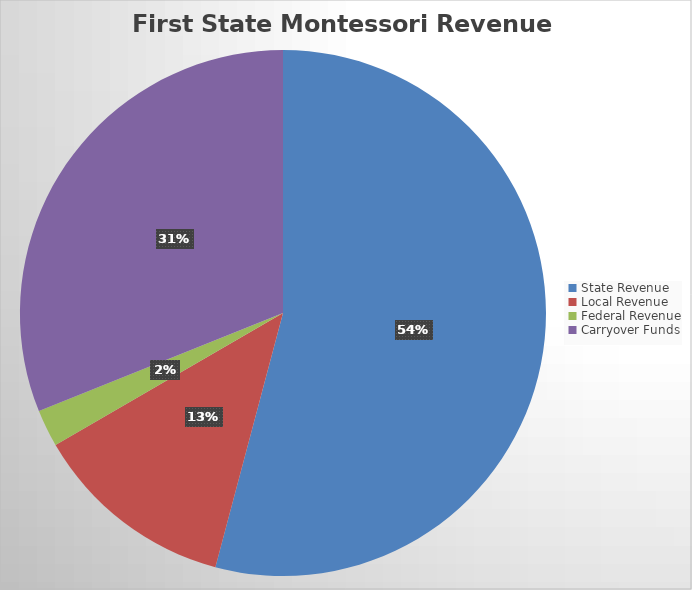
| Category | Series 0 |
|---|---|
| State Revenue | 5489743.25 |
| Local Revenue | 1266490.14 |
| Federal Revenue | 232837 |
| Carryover Funds | 3150705.38 |